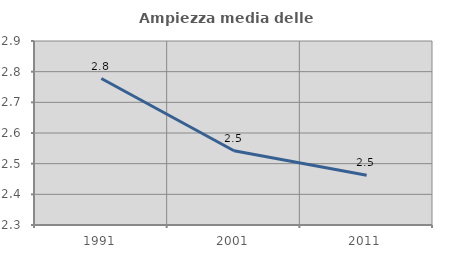
| Category | Ampiezza media delle famiglie |
|---|---|
| 1991.0 | 2.778 |
| 2001.0 | 2.542 |
| 2011.0 | 2.462 |